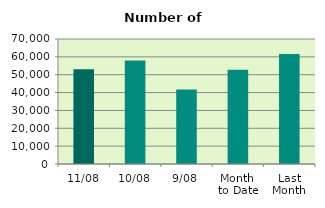
| Category | Series 0 |
|---|---|
| 11/08 | 53112 |
| 10/08 | 58000 |
| 9/08 | 41700 |
| Month 
to Date | 52766.889 |
| Last
Month | 61549.619 |